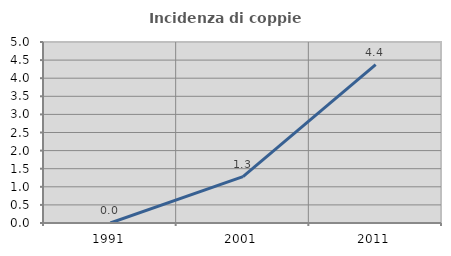
| Category | Incidenza di coppie miste |
|---|---|
| 1991.0 | 0 |
| 2001.0 | 1.282 |
| 2011.0 | 4.375 |